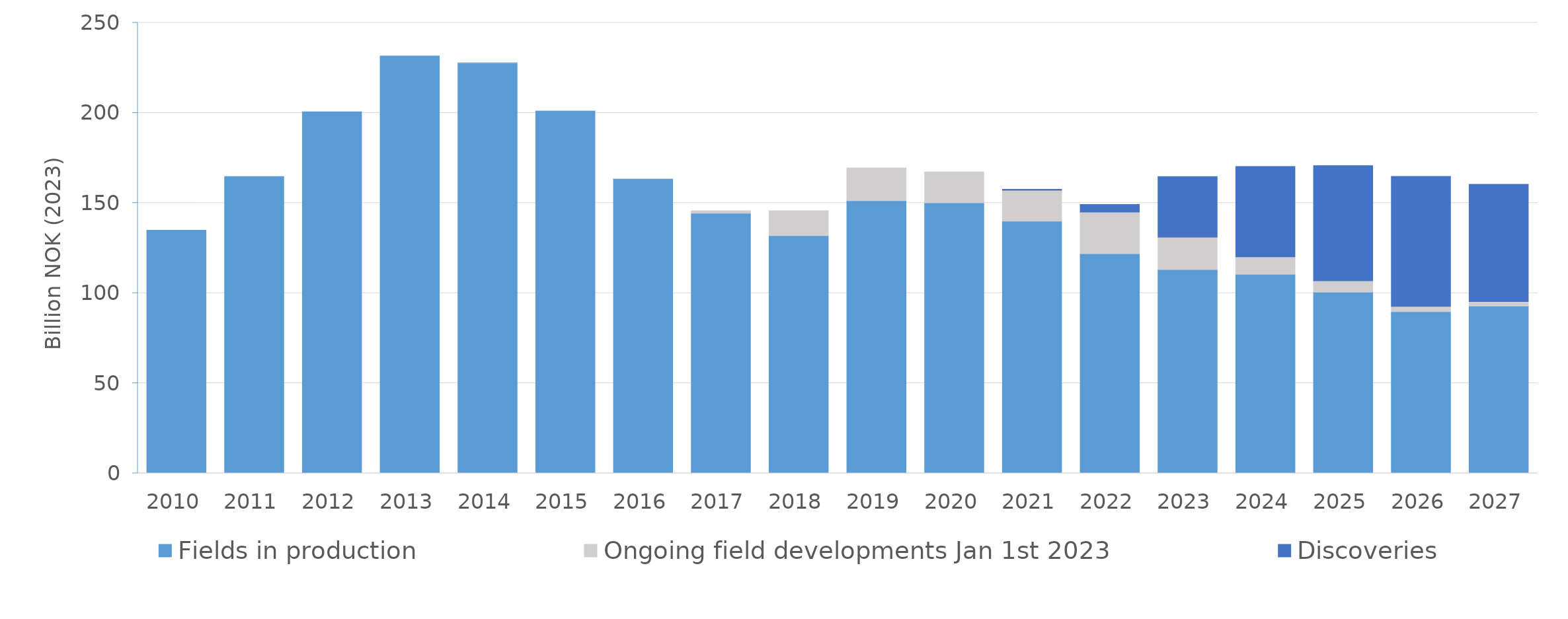
| Category | Fields in production | Ongoing field developments Jan 1st 2023 | Discoveries |
|---|---|---|---|
| 2010.0 | 134.879 | 0 | 0 |
| 2011.0 | 164.725 | 0 | 0 |
| 2012.0 | 200.64 | 0 | 0 |
| 2013.0 | 231.615 | 0 | 0 |
| 2014.0 | 227.787 | 0.001 | 0 |
| 2015.0 | 201.215 | 0.004 | 0 |
| 2016.0 | 163.475 | 0.006 | 0 |
| 2017.0 | 144.344 | 1.412 | 0 |
| 2018.0 | 131.899 | 13.777 | 0 |
| 2019.0 | 151.326 | 18.105 | 0 |
| 2020.0 | 150.084 | 17.172 | 0 |
| 2021.0 | 139.932 | 17.119 | 0.593 |
| 2022.0 | 121.843 | 23.121 | 4.267 |
| 2023.0 | 113.05 | 17.978 | 33.64 |
| 2024.0 | 110.432 | 9.69 | 50.122 |
| 2025.0 | 100.548 | 6.35 | 63.823 |
| 2026.0 | 89.682 | 2.958 | 72.156 |
| 2027.0 | 92.797 | 2.478 | 65.092 |